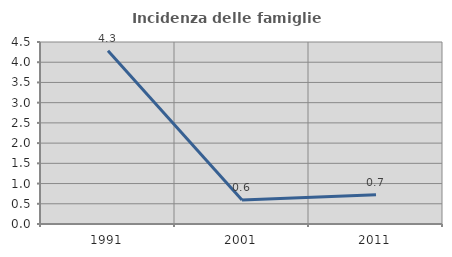
| Category | Incidenza delle famiglie numerose |
|---|---|
| 1991.0 | 4.286 |
| 2001.0 | 0.594 |
| 2011.0 | 0.723 |